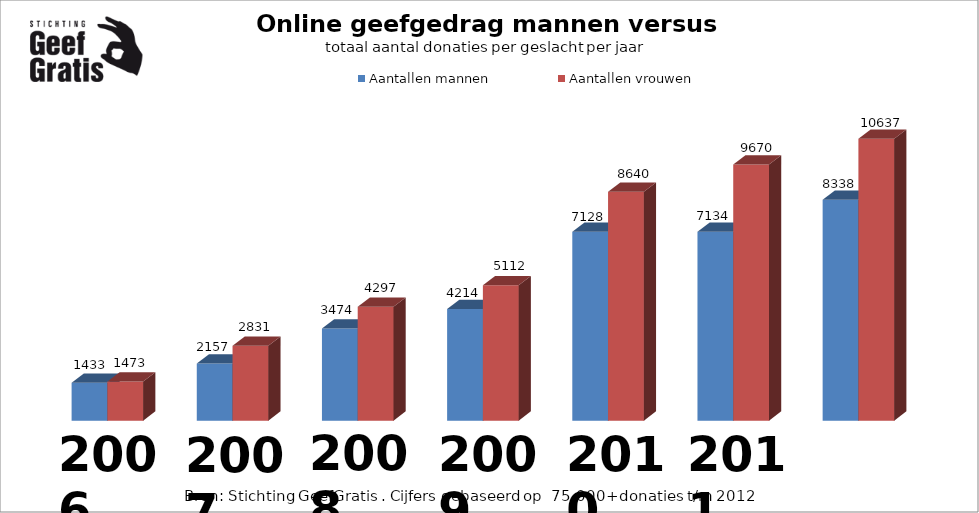
| Category | Aantallen mannen | Aantallen vrouwen |
|---|---|---|
| 0 | 1433 | 1473 |
| 1 | 2157 | 2831 |
| 2 | 3474 | 4297 |
| 3 | 4214 | 5112 |
| 4 | 7128 | 8640 |
| 5 | 7134 | 9670 |
| 6 | 8338 | 10637 |